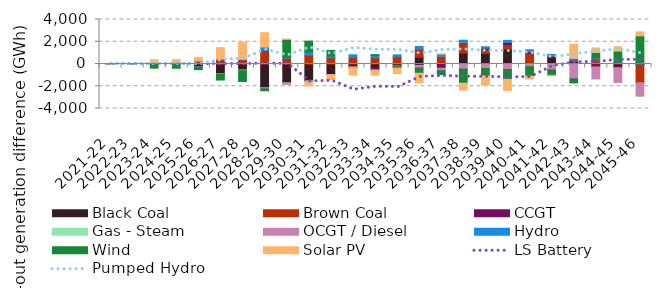
| Category | Black Coal | Brown Coal | CCGT | Gas - Steam | OCGT / Diesel | Hydro | Wind | Solar PV |
|---|---|---|---|---|---|---|---|---|
| 2021-22 | -2.125 | -0.67 | 0.025 | 0.001 | 0.003 | -0.009 | 0.038 | 1.873 |
| 2022-23 | 1.419 | -5.859 | 0.002 | 0 | 0.003 | -0.212 | 0.098 | 1.336 |
| 2023-24 | 46.97 | -21.893 | 0.122 | 0.137 | 0.211 | 14.576 | -354.269 | 333.732 |
| 2024-25 | 57.755 | -34.487 | 0.003 | -0.131 | 0.358 | 11.872 | -345.632 | 323.73 |
| 2025-26 | -281.12 | 261.641 | 0.003 | -0.99 | -5.593 | -3.11 | -218.725 | 319.531 |
| 2026-27 | -874.357 | 407.727 | 6.7 | -15.596 | -12.994 | 27.435 | -539.002 | 1029.783 |
| 2027-28 | -499.792 | 383.288 | -47.556 | -21.048 | -30.725 | 39.922 | -975.313 | 1515.569 |
| 2028-29 | -2144.122 | 1202.458 | 28.789 | -59.06 | -33.566 | 295.48 | -166.952 | 1287.355 |
| 2029-30 | -1663.204 | 524.046 | -36.303 | -62.048 | -67.86 | 97.177 | 1586.201 | 50.413 |
| 2030-31 | -1469.982 | 803.814 | -50.759 | -44.994 | -50.552 | 277.714 | 974.882 | -350.978 |
| 2031-32 | -951.622 | 560.752 | 0.003 | -6.099 | -10.948 | 140.924 | 525.411 | -432.05 |
| 2032-33 | -200.219 | 569.79 | -69.517 | -6.187 | -44.784 | 255.534 | -14.992 | -655.301 |
| 2033-34 | -327.354 | 553.339 | -216.3 | -6.809 | -42.9 | 207.501 | 84.288 | -409.333 |
| 2034-35 | -100.581 | 639.438 | -90.396 | -20.995 | -23.683 | 181.738 | -132.633 | -494.828 |
| 2035-36 | 597.713 | 733.227 | -152.981 | -22.288 | -181.447 | 248.12 | -473.859 | -869.483 |
| 2036-37 | 113.759 | 576.396 | -376.411 | 0.415 | -226.971 | 190.154 | -351.535 | 11.477 |
| 2037-38 | 976.721 | 926.799 | 16.923 | 25.233 | -456.906 | 194.029 | -1266.737 | -618.827 |
| 2038-39 | 948.581 | 352.261 | 113.041 | -5.243 | -406.424 | 136.785 | -657.29 | -819.032 |
| 2039-40 | 1351.207 | 381.123 | 205.46 | 0 | -496.457 | 187.006 | -884.289 | -996.328 |
| 2040-41 | 150.489 | 797.766 | 153.433 | 0 | -238.054 | 176.66 | -855.138 | -243.634 |
| 2041-42 | 636.699 | 124.082 | -0.366 | 0 | -526.466 | 103.738 | -490.353 | -0.35 |
| 2042-43 | 226.059 | 100.069 | 17.47 | 0 | -1328.112 | 171.721 | -373.318 | 1264.52 |
| 2043-44 | -93.453 | 437.714 | -171.562 | 0 | -1076.616 | 98.811 | 498.673 | 410.017 |
| 2044-45 | -223.826 | 111.719 | -115.449 | 0 | -1313.148 | 47.239 | 1003.774 | 391.93 |
| 2045-46 | -43.559 | -1643.774 | 2.695 | 0 | -1210.172 | 144.27 | 2385.022 | 358.82 |